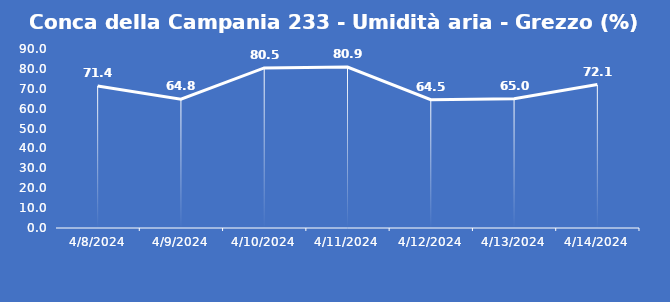
| Category | Conca della Campania 233 - Umidità aria - Grezzo (%) |
|---|---|
| 4/8/24 | 71.4 |
| 4/9/24 | 64.8 |
| 4/10/24 | 80.5 |
| 4/11/24 | 80.9 |
| 4/12/24 | 64.5 |
| 4/13/24 | 65 |
| 4/14/24 | 72.1 |